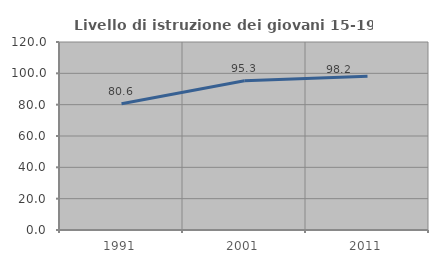
| Category | Livello di istruzione dei giovani 15-19 anni |
|---|---|
| 1991.0 | 80.556 |
| 2001.0 | 95.276 |
| 2011.0 | 98.198 |